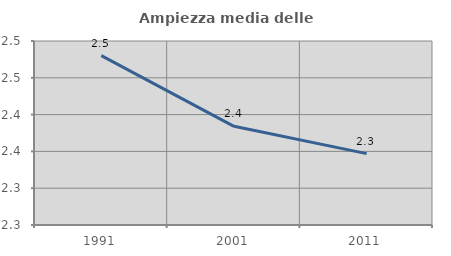
| Category | Ampiezza media delle famiglie |
|---|---|
| 1991.0 | 2.48 |
| 2001.0 | 2.384 |
| 2011.0 | 2.347 |